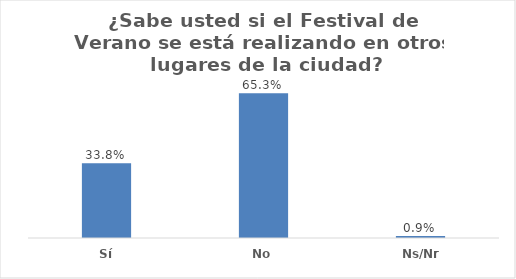
| Category | Series 0 |
|---|---|
| Sí | 0.338 |
| No | 0.653 |
| Ns/Nr | 0.009 |